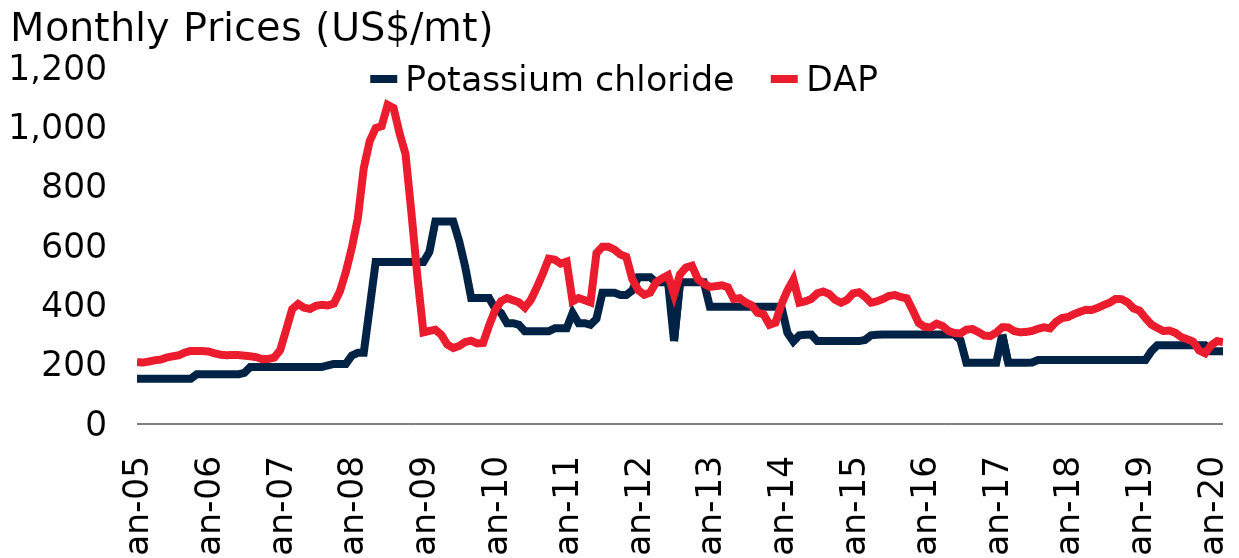
| Category | Potassium chloride | DAP |
|---|---|---|
| 2005-01-01 | 152.5 | 208.6 |
| 2005-02-01 | 152.5 | 207.125 |
| 2005-03-01 | 152.5 | 210.625 |
| 2005-04-01 | 152.5 | 214.75 |
| 2005-05-01 | 152.5 | 217.2 |
| 2005-06-01 | 152.5 | 224.25 |
| 2005-07-01 | 152.5 | 228.25 |
| 2005-08-01 | 152.5 | 231.5 |
| 2005-09-01 | 152.5 | 240.75 |
| 2005-10-01 | 152.5 | 246.375 |
| 2005-11-01 | 167.5 | 246.125 |
| 2005-12-01 | 167.5 | 245.875 |
| 2006-01-01 | 167.5 | 244.3 |
| 2006-02-01 | 167.5 | 238.125 |
| 2006-03-01 | 167.5 | 233.625 |
| 2006-04-01 | 167.5 | 231.75 |
| 2006-05-01 | 167.5 | 232.9 |
| 2006-06-01 | 167.5 | 232.375 |
| 2006-07-01 | 172.5 | 230.3 |
| 2006-08-01 | 192.5 | 228.25 |
| 2006-09-01 | 192.5 | 225.125 |
| 2006-10-01 | 192.5 | 218.5 |
| 2006-11-01 | 192.5 | 219.375 |
| 2006-12-01 | 192.5 | 223.833 |
| 2007-01-01 | 192.5 | 249.2 |
| 2007-02-01 | 192.5 | 317.625 |
| 2007-03-01 | 192.5 | 387 |
| 2007-04-01 | 192.5 | 404.6 |
| 2007-05-01 | 192.5 | 392 |
| 2007-06-01 | 192.5 | 387.875 |
| 2007-07-01 | 192.5 | 398.5 |
| 2007-08-01 | 192.5 | 401.625 |
| 2007-09-01 | 197.5 | 399.625 |
| 2007-10-01 | 202.5 | 406 |
| 2007-11-01 | 202.5 | 447 |
| 2007-12-01 | 202.5 | 512.5 |
| 2008-01-01 | 230.625 | 593.875 |
| 2008-02-01 | 240 | 692.5 |
| 2008-03-01 | 240 | 862.2 |
| 2008-04-01 | 393 | 953.5 |
| 2008-05-01 | 546 | 997.5 |
| 2008-06-01 | 546 | 1004.1 |
| 2008-07-01 | 546 | 1075.75 |
| 2008-08-01 | 546 | 1065 |
| 2008-09-01 | 546 | 980 |
| 2008-10-01 | 546 | 910 |
| 2008-11-01 | 546 | 710 |
| 2008-12-01 | 546 | 495 |
| 2009-01-01 | 546 | 308.875 |
| 2009-02-01 | 580.125 | 313.75 |
| 2009-03-01 | 682.5 | 317.8 |
| 2009-04-01 | 682.5 | 300.625 |
| 2009-05-01 | 682.5 | 267.875 |
| 2009-06-01 | 682.5 | 256.1 |
| 2009-07-01 | 615.625 | 263.25 |
| 2009-08-01 | 530 | 276.4 |
| 2009-09-01 | 425 | 280.625 |
| 2009-10-01 | 425 | 271.625 |
| 2009-11-01 | 425 | 273.2 |
| 2009-12-01 | 425 | 331.5 |
| 2010-01-01 | 389.375 | 383 |
| 2010-02-01 | 374.375 | 413.625 |
| 2010-03-01 | 340 | 424.5 |
| 2010-04-01 | 340 | 417.5 |
| 2010-05-01 | 334.5 | 410 |
| 2010-06-01 | 312.5 | 392.5 |
| 2010-07-01 | 312.5 | 418.125 |
| 2010-08-01 | 312.5 | 459.9 |
| 2010-09-01 | 312.5 | 506 |
| 2010-10-01 | 312.5 | 557.25 |
| 2010-11-01 | 322.5 | 554.1 |
| 2010-12-01 | 322.5 | 540.625 |
| 2011-01-01 | 322.5 | 547.4 |
| 2011-02-01 | 374.375 | 413.625 |
| 2011-03-01 | 340 | 424.5 |
| 2011-04-01 | 340 | 417.5 |
| 2011-05-01 | 334.5 | 410 |
| 2011-06-01 | 355 | 575.875 |
| 2011-07-01 | 442.5 | 597.625 |
| 2011-08-01 | 442.5 | 597.4 |
| 2011-09-01 | 442.5 | 587.875 |
| 2011-10-01 | 435 | 571.4 |
| 2011-11-01 | 435 | 563.5 |
| 2011-12-01 | 450 | 488.75 |
| 2012-01-01 | 495 | 451.4 |
| 2012-02-01 | 495 | 435.5 |
| 2012-03-01 | 495 | 442.875 |
| 2012-04-01 | 477.5 | 478 |
| 2012-05-01 | 477.5 | 490.5 |
| 2012-06-01 | 477.5 | 501.625 |
| 2012-07-01 | 279.5 | 436.875 |
| 2012-08-01 | 477.5 | 504.5 |
| 2012-09-01 | 477.5 | 527.375 |
| 2012-10-01 | 477.5 | 533.5 |
| 2012-11-01 | 477.5 | 487.875 |
| 2012-12-01 | 477.5 | 472.833 |
| 2013-01-01 | 395 | 462.25 |
| 2013-02-01 | 395 | 464.5 |
| 2013-03-01 | 395 | 467.625 |
| 2013-04-01 | 395 | 461.125 |
| 2013-05-01 | 395 | 421.25 |
| 2013-06-01 | 395 | 424.125 |
| 2013-07-01 | 395 | 409.625 |
| 2013-08-01 | 395 | 400.375 |
| 2013-09-01 | 395 | 374.8 |
| 2013-10-01 | 395 | 370 |
| 2013-11-01 | 395 | 334.375 |
| 2013-12-01 | 395 | 341.625 |
| 2014-01-01 | 395 | 403.375 |
| 2014-02-01 | 307.625 | 450.125 |
| 2014-03-01 | 278.5 | 486.5 |
| 2014-04-01 | 299 | 409 |
| 2014-05-01 | 300.875 | 413.562 |
| 2014-06-01 | 301.5 | 421.375 |
| 2014-07-01 | 279.5 | 440.625 |
| 2014-08-01 | 279.5 | 446.5 |
| 2014-09-01 | 279.5 | 438.1 |
| 2014-10-01 | 279.5 | 418.75 |
| 2014-11-01 | 279.5 | 408.75 |
| 2014-12-01 | 279.5 | 418.375 |
| 2015-01-01 | 279.5 | 440.25 |
| 2015-02-01 | 279.5 | 444.125 |
| 2015-03-01 | 283.4 | 428.8 |
| 2015-04-01 | 299 | 409 |
| 2015-05-01 | 300.875 | 413.562 |
| 2015-06-01 | 301.5 | 421.375 |
| 2015-07-01 | 301.5 | 431.5 |
| 2015-08-01 | 301.5 | 434.625 |
| 2015-09-01 | 301.5 | 428 |
| 2015-10-01 | 301.5 | 423.75 |
| 2015-11-01 | 301.5 | 383.875 |
| 2015-12-01 | 301.5 | 340.625 |
| 2016-01-01 | 301.5 | 327.125 |
| 2016-02-01 | 301.5 | 326 |
| 2016-03-01 | 301.5 | 338.125 |
| 2016-04-01 | 301.5 | 330.5 |
| 2016-05-01 | 301.5 | 313.5 |
| 2016-06-01 | 301.5 | 306.625 |
| 2016-07-01 | 282.5 | 305.2 |
| 2016-08-01 | 206.5 | 318.062 |
| 2016-09-01 | 206.5 | 320 |
| 2016-10-01 | 206.5 | 310 |
| 2016-11-01 | 206.5 | 298 |
| 2016-12-01 | 206.5 | 296.625 |
| 2017-01-01 | 206.5 | 308 |
| 2017-02-01 | 301.5 | 326 |
| 2017-03-01 | 206.5 | 325.625 |
| 2017-04-01 | 206.5 | 313.125 |
| 2017-05-01 | 206.5 | 309.25 |
| 2017-06-01 | 206.5 | 310.3 |
| 2017-07-01 | 207.25 | 313.75 |
| 2017-08-01 | 215.5 | 320.75 |
| 2017-09-01 | 215.5 | 325.9 |
| 2017-10-01 | 215.5 | 322.375 |
| 2017-11-01 | 215.5 | 344 |
| 2017-12-01 | 215.5 | 357.25 |
| 2018-01-01 | 215.5 | 360.375 |
| 2018-02-01 | 215.5 | 370 |
| 2018-03-01 | 215.5 | 378 |
| 2018-04-01 | 215.5 | 384.75 |
| 2018-05-01 | 215.5 | 384.375 |
| 2018-06-01 | 215.5 | 391.6 |
| 2018-07-01 | 215.5 | 400.75 |
| 2018-08-01 | 215.5 | 409 |
| 2018-09-01 | 215.5 | 421.63 |
| 2018-10-01 | 215.5 | 420.75 |
| 2018-11-01 | 215.5 | 410.2 |
| 2018-12-01 | 215.5 | 389.67 |
| 2019-01-01 | 215.5 | 382.13 |
| 2019-02-01 | 215.5 | 357.38 |
| 2019-03-01 | 245.5 | 335.03 |
| 2019-04-01 | 265.5 | 323.75 |
| 2019-05-01 | 265.5 | 313.4 |
| 2019-06-01 | 265.5 | 314.88 |
| 2019-07-01 | 265.5 | 307.5 |
| 2019-08-01 | 265.5 | 292.9 |
| 2019-09-01 | 265.5 | 285.75 |
| 2019-10-01 | 265.5 | 277.38 |
| 2019-11-01 | 265.5 | 248 |
| 2019-12-01 | 265.5 | 238.16 |
| 2020-01-01 | 245 | 264.9 |
| 2020-02-01 | 245 | 279.38 |
| 2020-03-01 | 245 | 276.22 |